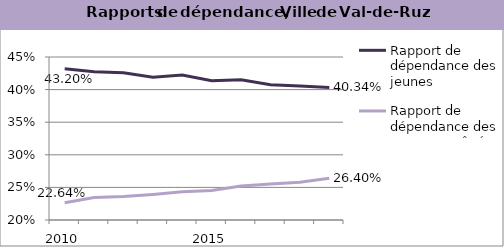
| Category | Rapport de dépendance des jeunes | Rapport de dépendance des personnes âgées |
|---|---|---|
| 2010.0 | 0.432 | 0.226 |
| 2011.0 | 0.428 | 0.234 |
| 2012.0 | 0.426 | 0.236 |
| 2013.0 | 0.419 | 0.239 |
| 2014.0 | 0.422 | 0.243 |
| 2015.0 | 0.413 | 0.245 |
| 2016.0 | 0.415 | 0.252 |
| 2017.0 | 0.408 | 0.255 |
| 2018.0 | 0.406 | 0.258 |
| 2019.0 | 0.403 | 0.264 |